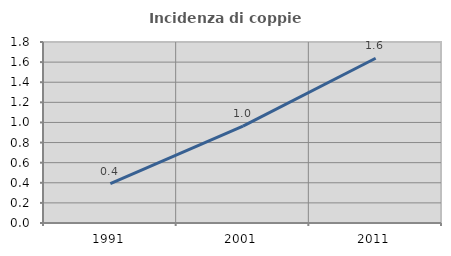
| Category | Incidenza di coppie miste |
|---|---|
| 1991.0 | 0.392 |
| 2001.0 | 0.963 |
| 2011.0 | 1.638 |